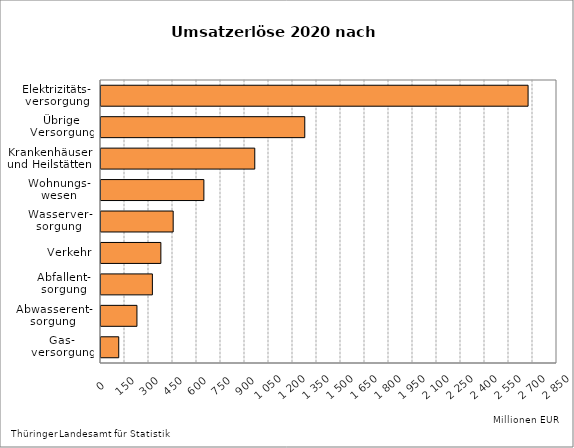
| Category | Series 1 |
|---|---|
| Gas-
versorgung | 110.923 |
| Abwasserent-
sorgung | 224.664 |
| Abfallent-
sorgung | 321.185 |
| Verkehr | 374.154 |
| Wasserver-
sorgung | 451.154 |
| Wohnungs-
wesen | 643.047 |
| Krankenhäuser
und Heilstätten | 961.062 |
| Übrige
Versorgung | 1273.612 |
| Elektrizitäts-
versorgung | 2669.319 |